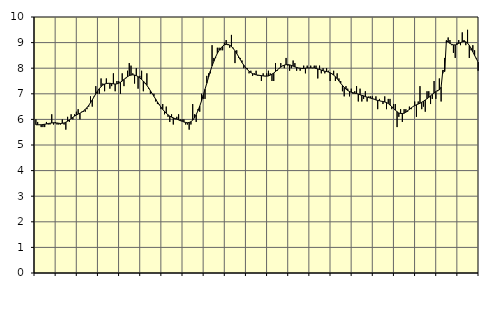
| Category | Piggar | Series 1 |
|---|---|---|
| nan | 6 | 5.79 |
| 1.0 | 5.9 | 5.79 |
| 1.0 | 5.8 | 5.79 |
| 1.0 | 5.7 | 5.79 |
| 1.0 | 5.7 | 5.8 |
| 1.0 | 5.7 | 5.81 |
| 1.0 | 5.9 | 5.82 |
| 1.0 | 5.8 | 5.84 |
| 1.0 | 5.8 | 5.85 |
| 1.0 | 6.2 | 5.86 |
| 1.0 | 5.8 | 5.87 |
| 1.0 | 5.9 | 5.86 |
| nan | 5.8 | 5.86 |
| 2.0 | 5.8 | 5.85 |
| 2.0 | 5.8 | 5.84 |
| 2.0 | 6 | 5.85 |
| 2.0 | 5.8 | 5.86 |
| 2.0 | 5.6 | 5.89 |
| 2.0 | 6.1 | 5.93 |
| 2.0 | 5.9 | 5.98 |
| 2.0 | 6.2 | 6.03 |
| 2.0 | 6 | 6.08 |
| 2.0 | 6.2 | 6.13 |
| 2.0 | 6.3 | 6.17 |
| nan | 6.4 | 6.21 |
| 3.0 | 6 | 6.24 |
| 3.0 | 6.3 | 6.28 |
| 3.0 | 6.3 | 6.33 |
| 3.0 | 6.3 | 6.39 |
| 3.0 | 6.4 | 6.46 |
| 3.0 | 6.5 | 6.55 |
| 3.0 | 6.9 | 6.65 |
| 3.0 | 6.5 | 6.76 |
| 3.0 | 6.9 | 6.88 |
| 3.0 | 7.3 | 7 |
| 3.0 | 7 | 7.11 |
| nan | 7 | 7.2 |
| 4.0 | 7.6 | 7.28 |
| 4.0 | 7.4 | 7.34 |
| 4.0 | 7.1 | 7.38 |
| 4.0 | 7.6 | 7.4 |
| 4.0 | 7.4 | 7.41 |
| 4.0 | 7.2 | 7.41 |
| 4.0 | 7.3 | 7.4 |
| 4.0 | 7.8 | 7.39 |
| 4.0 | 7.1 | 7.38 |
| 4.0 | 7.5 | 7.39 |
| 4.0 | 7.5 | 7.41 |
| nan | 7 | 7.45 |
| 5.0 | 7.8 | 7.5 |
| 5.0 | 7.3 | 7.56 |
| 5.0 | 7.6 | 7.62 |
| 5.0 | 7.9 | 7.67 |
| 5.0 | 8.2 | 7.71 |
| 5.0 | 8.1 | 7.73 |
| 5.0 | 7.8 | 7.74 |
| 5.0 | 7.4 | 7.73 |
| 5.0 | 8 | 7.71 |
| 5.0 | 7.2 | 7.67 |
| 5.0 | 7.7 | 7.62 |
| nan | 7.9 | 7.56 |
| 6.0 | 7.1 | 7.5 |
| 6.0 | 7.4 | 7.42 |
| 6.0 | 7.8 | 7.33 |
| 6.0 | 7.2 | 7.23 |
| 6.0 | 7 | 7.12 |
| 6.0 | 7 | 7.01 |
| 6.0 | 7 | 6.9 |
| 6.0 | 6.7 | 6.79 |
| 6.0 | 6.6 | 6.68 |
| 6.0 | 6.6 | 6.58 |
| 6.0 | 6.4 | 6.48 |
| nan | 6.6 | 6.39 |
| 7.0 | 6.2 | 6.31 |
| 7.0 | 6.5 | 6.24 |
| 7.0 | 6.1 | 6.18 |
| 7.0 | 5.9 | 6.13 |
| 7.0 | 6.2 | 6.09 |
| 7.0 | 5.8 | 6.06 |
| 7.0 | 6 | 6.03 |
| 7.0 | 6.1 | 6.01 |
| 7.0 | 6.2 | 5.98 |
| 7.0 | 6 | 5.95 |
| 7.0 | 6 | 5.93 |
| nan | 6 | 5.9 |
| 8.0 | 5.8 | 5.88 |
| 8.0 | 5.8 | 5.87 |
| 8.0 | 5.6 | 5.88 |
| 8.0 | 5.8 | 5.91 |
| 8.0 | 6.6 | 5.97 |
| 8.0 | 6.2 | 6.06 |
| 8.0 | 5.9 | 6.19 |
| 8.0 | 6.4 | 6.34 |
| 8.0 | 6.3 | 6.52 |
| 8.0 | 7 | 6.72 |
| 8.0 | 6.8 | 6.95 |
| nan | 6.8 | 7.18 |
| 9.0 | 7.7 | 7.41 |
| 9.0 | 7.8 | 7.65 |
| 9.0 | 7.8 | 7.88 |
| 9.0 | 8.9 | 8.09 |
| 9.0 | 8.4 | 8.27 |
| 9.0 | 8.4 | 8.44 |
| 9.0 | 8.8 | 8.58 |
| 9.0 | 8.8 | 8.7 |
| 9.0 | 8.7 | 8.79 |
| 9.0 | 8.7 | 8.86 |
| 9.0 | 9 | 8.91 |
| nan | 9.1 | 8.93 |
| 10.0 | 8.9 | 8.93 |
| 10.0 | 8.8 | 8.9 |
| 10.0 | 9.3 | 8.85 |
| 10.0 | 8.8 | 8.77 |
| 10.0 | 8.2 | 8.68 |
| 10.0 | 8.7 | 8.57 |
| 10.0 | 8.4 | 8.46 |
| 10.0 | 8.4 | 8.34 |
| 10.0 | 8.3 | 8.22 |
| 10.0 | 8 | 8.12 |
| 10.0 | 8 | 8.03 |
| nan | 8 | 7.95 |
| 11.0 | 7.8 | 7.88 |
| 11.0 | 7.9 | 7.83 |
| 11.0 | 7.7 | 7.79 |
| 11.0 | 7.8 | 7.76 |
| 11.0 | 7.9 | 7.74 |
| 11.0 | 7.7 | 7.73 |
| 11.0 | 7.7 | 7.72 |
| 11.0 | 7.5 | 7.71 |
| 11.0 | 7.8 | 7.7 |
| 11.0 | 7.7 | 7.69 |
| 11.0 | 7.8 | 7.69 |
| nan | 7.9 | 7.7 |
| 12.0 | 7.8 | 7.73 |
| 12.0 | 7.5 | 7.77 |
| 12.0 | 7.5 | 7.81 |
| 12.0 | 8.2 | 7.87 |
| 12.0 | 7.9 | 7.93 |
| 12.0 | 8 | 7.99 |
| 12.0 | 8.2 | 8.04 |
| 12.0 | 8.1 | 8.09 |
| 12.0 | 8 | 8.12 |
| 12.0 | 8.4 | 8.14 |
| 12.0 | 8.1 | 8.14 |
| nan | 7.9 | 8.13 |
| 13.0 | 8 | 8.11 |
| 13.0 | 8.3 | 8.08 |
| 13.0 | 8.2 | 8.05 |
| 13.0 | 7.9 | 8.03 |
| 13.0 | 8 | 8.01 |
| 13.0 | 7.9 | 8 |
| 13.0 | 8 | 7.99 |
| 13.0 | 8.1 | 7.99 |
| 13.0 | 7.8 | 8 |
| 13.0 | 8.1 | 8.01 |
| 13.0 | 8 | 8.01 |
| nan | 8.1 | 8.01 |
| 14.0 | 8 | 8.01 |
| 14.0 | 8.1 | 8.01 |
| 14.0 | 8.1 | 7.99 |
| 14.0 | 7.6 | 7.97 |
| 14.0 | 8.1 | 7.95 |
| 14.0 | 7.8 | 7.93 |
| 14.0 | 8 | 7.9 |
| 14.0 | 7.8 | 7.88 |
| 14.0 | 8 | 7.87 |
| 14.0 | 7.9 | 7.85 |
| 14.0 | 7.5 | 7.82 |
| nan | 7.8 | 7.78 |
| 15.0 | 7.9 | 7.73 |
| 15.0 | 7.5 | 7.67 |
| 15.0 | 7.8 | 7.59 |
| 15.0 | 7.6 | 7.5 |
| 15.0 | 7.5 | 7.41 |
| 15.0 | 7.1 | 7.33 |
| 15.0 | 6.9 | 7.25 |
| 15.0 | 7.3 | 7.18 |
| 15.0 | 7.2 | 7.13 |
| 15.0 | 6.9 | 7.09 |
| 15.0 | 7.2 | 7.06 |
| nan | 7 | 7.04 |
| 16.0 | 7.1 | 7.02 |
| 16.0 | 7.3 | 7.01 |
| 16.0 | 6.7 | 6.99 |
| 16.0 | 7.2 | 6.96 |
| 16.0 | 6.7 | 6.94 |
| 16.0 | 6.8 | 6.92 |
| 16.0 | 7.1 | 6.89 |
| 16.0 | 6.7 | 6.87 |
| 16.0 | 6.9 | 6.85 |
| 16.0 | 6.9 | 6.83 |
| 16.0 | 6.9 | 6.81 |
| nan | 6.8 | 6.79 |
| 17.0 | 6.9 | 6.76 |
| 17.0 | 6.4 | 6.74 |
| 17.0 | 6.8 | 6.73 |
| 17.0 | 6.7 | 6.71 |
| 17.0 | 6.6 | 6.7 |
| 17.0 | 6.9 | 6.68 |
| 17.0 | 6.4 | 6.66 |
| 17.0 | 6.8 | 6.62 |
| 17.0 | 6.8 | 6.56 |
| 17.0 | 6.4 | 6.5 |
| 17.0 | 6.6 | 6.43 |
| nan | 6.6 | 6.36 |
| 18.0 | 5.7 | 6.3 |
| 18.0 | 6.1 | 6.25 |
| 18.0 | 6.4 | 6.23 |
| 18.0 | 5.9 | 6.23 |
| 18.0 | 6.4 | 6.24 |
| 18.0 | 6.4 | 6.28 |
| 18.0 | 6.3 | 6.34 |
| 18.0 | 6.5 | 6.39 |
| 18.0 | 6.4 | 6.45 |
| 18.0 | 6.5 | 6.5 |
| 18.0 | 6.7 | 6.54 |
| nan | 6.1 | 6.57 |
| 19.0 | 6.7 | 6.6 |
| 19.0 | 7.3 | 6.63 |
| 19.0 | 6.4 | 6.67 |
| 19.0 | 6.5 | 6.71 |
| 19.0 | 6.3 | 6.76 |
| 19.0 | 7.1 | 6.81 |
| 19.0 | 7.1 | 6.86 |
| 19.0 | 6.6 | 6.92 |
| 19.0 | 6.8 | 6.98 |
| 19.0 | 7.5 | 7.03 |
| 19.0 | 6.8 | 7.09 |
| nan | 7.1 | 7.13 |
| 20.0 | 7.6 | 7.15 |
| 20.0 | 6.7 | 7.26 |
| 20.0 | 7.8 | 7.92 |
| 20.0 | 8.4 | 7.87 |
| 20.0 | 9 | 9.08 |
| 20.0 | 9.2 | 9.02 |
| 20.0 | 9.1 | 8.97 |
| 20.0 | 8.9 | 8.93 |
| 20.0 | 8.6 | 8.91 |
| 20.0 | 8.4 | 8.91 |
| 20.0 | 9 | 8.93 |
| nan | 9.1 | 8.97 |
| 21.0 | 8.9 | 9 |
| 21.0 | 9.4 | 9.03 |
| 21.0 | 9.1 | 9.05 |
| 21.0 | 8.9 | 9.03 |
| 21.0 | 9.5 | 8.98 |
| 21.0 | 8.4 | 8.89 |
| 21.0 | 8.7 | 8.78 |
| 21.0 | 8.9 | 8.64 |
| 21.0 | 8.7 | 8.5 |
| 21.0 | 8.4 | 8.37 |
| 21.0 | 7.9 | 8.24 |